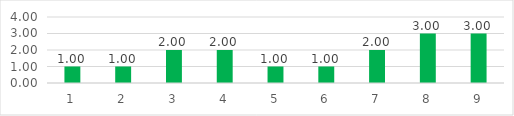
| Category | Series 0 |
|---|---|
| 0 | 1 |
| 1 | 1 |
| 2 | 2 |
| 3 | 2 |
| 4 | 1 |
| 5 | 1 |
| 6 | 2 |
| 7 | 3 |
| 8 | 3 |